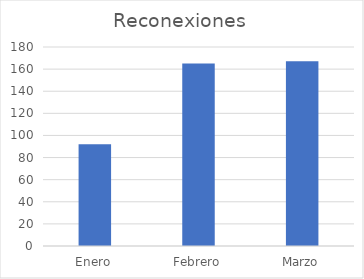
| Category | Reconexiones |
|---|---|
| Enero | 92 |
| Febrero | 165 |
| Marzo | 167 |